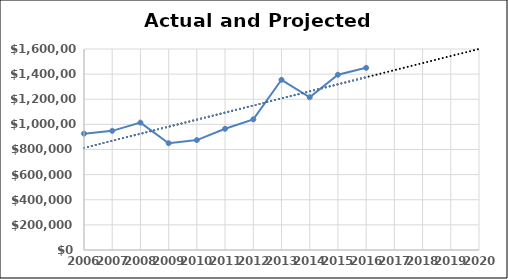
| Category | Series 0 |
|---|---|
| 2006.0 | 926000 |
| 2007.0 | 948500 |
| 2008.0 | 1014000 |
| 2009.0 | 850000 |
| 2010.0 | 875000 |
| 2011.0 | 965000 |
| 2012.0 | 1040000 |
| 2013.0 | 1355000 |
| 2014.0 | 1216000 |
| 2015.0 | 1395000 |
| 2016.0 | 1450000 |